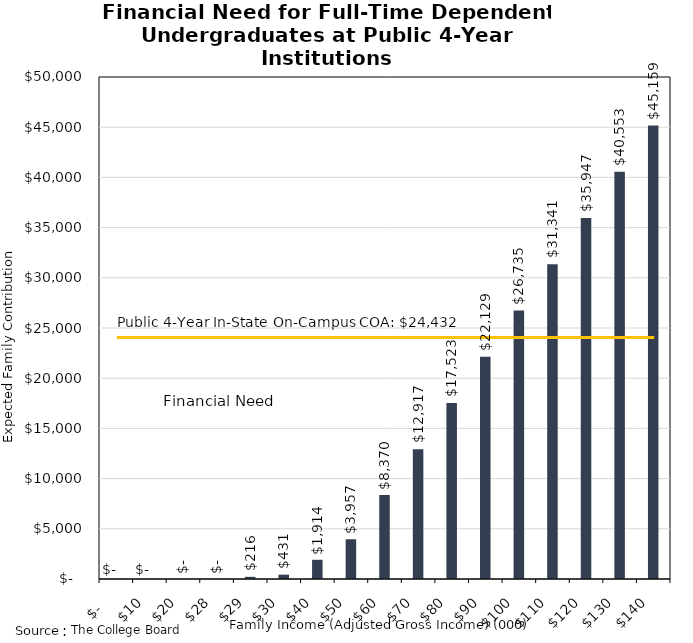
| Category | Series 0 |
|---|---|
| 0.0 | 0 |
| 10.0 | 0 |
| 20.0 | 0 |
| 28.0 | 0 |
| 29.0 | 216 |
| 30.0 | 431 |
| 40.0 | 1914 |
| 50.0 | 3957 |
| 60.0 | 8370 |
| 70.0 | 12917 |
| 80.0 | 17523 |
| 90.0 | 22129 |
| 100.0 | 26735 |
| 110.0 | 31341 |
| 120.0 | 35947 |
| 130.0 | 40553 |
| 140.0 | 45159 |